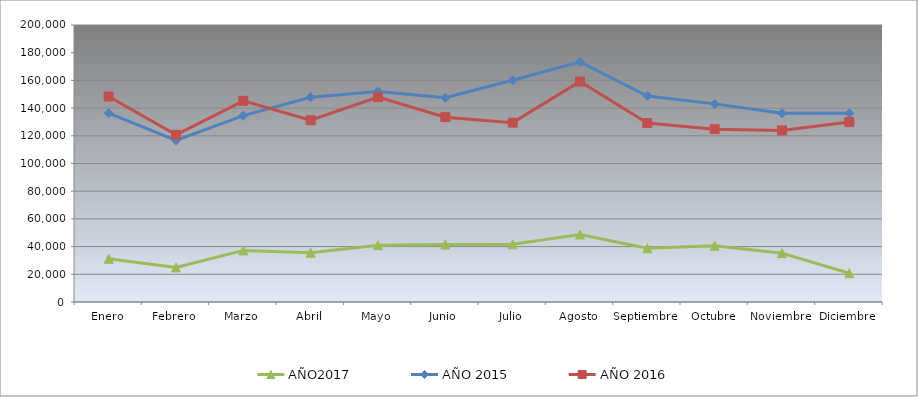
| Category | AÑO2017 | AÑO 2015 | AÑO 2016 |
|---|---|---|---|
| Enero | 31169.048 | 136319.861 | 148355.657 |
| Febrero | 24960.914 | 116673.996 | 120686.609 |
| Marzo | 37267.14 | 134609.424 | 145235.535 |
| Abril | 35598.189 | 147778.942 | 131219.158 |
| Mayo | 40999.356 | 151929.138 | 147904.62 |
| Junio | 41494.54 | 147470.464 | 133443.8 |
| Julio | 41650.431 | 160055.158 | 129508.266 |
| Agosto | 48711.38 | 173349.235 | 159151.328 |
| Septiembre | 38752.691 | 148687.579 | 129242.755 |
| Octubre | 40586.704 | 143044.129 | 124770.481 |
| Noviembre | 35277.236 | 136227.444 | 123893.523 |
| Diciembre | 20770.195 | 136245.379 | 129900.555 |